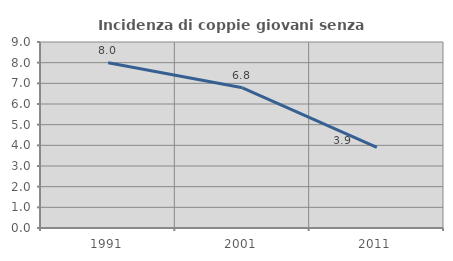
| Category | Incidenza di coppie giovani senza figli |
|---|---|
| 1991.0 | 8 |
| 2001.0 | 6.784 |
| 2011.0 | 3.896 |